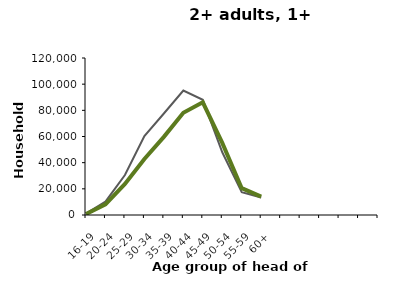
| Category | Series 1 | Series 2 |
|---|---|---|
| 16-19 | 1020 | 719 |
| 20-24 | 10171 | 8191 |
| 25-29 | 30571 | 23715 |
| 30-34 | 60283 | 42849 |
| 35-39 | 77578 | 59713 |
| 40-44 | 95085 | 78098 |
| 45-49 | 88015 | 86131 |
| 50-54 | 47950 | 55121 |
| 55-59 | 17377 | 20507 |
| 60+ | 13373 | 14014 |